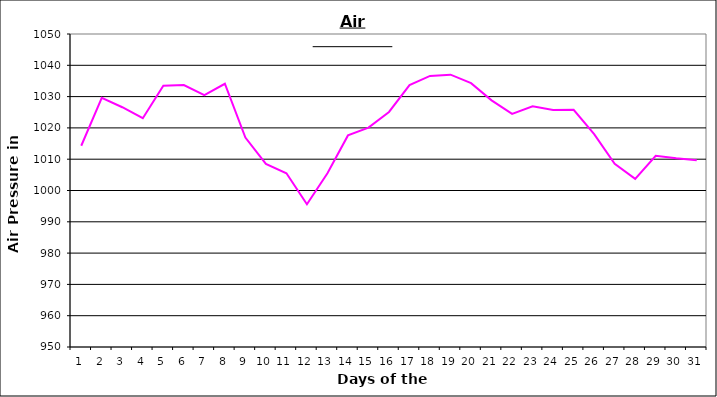
| Category | Series 0 |
|---|---|
| 0 | 1014.3 |
| 1 | 1029.6 |
| 2 | 1026.6 |
| 3 | 1023.1 |
| 4 | 1033.5 |
| 5 | 1033.7 |
| 6 | 1030.5 |
| 7 | 1034.1 |
| 8 | 1016.9 |
| 9 | 1008.5 |
| 10 | 1005.5 |
| 11 | 995.6 |
| 12 | 1005.5 |
| 13 | 1017.6 |
| 14 | 1020.1 |
| 15 | 1025.1 |
| 16 | 1033.7 |
| 17 | 1036.6 |
| 18 | 1037 |
| 19 | 1034.3 |
| 20 | 1028.8 |
| 21 | 1024.5 |
| 22 | 1026.9 |
| 23 | 1025.7 |
| 24 | 1025.8 |
| 25 | 1018 |
| 26 | 1008.5 |
| 27 | 1003.7 |
| 28 | 1011.1 |
| 29 | 1010.3 |
| 30 | 1009.7 |